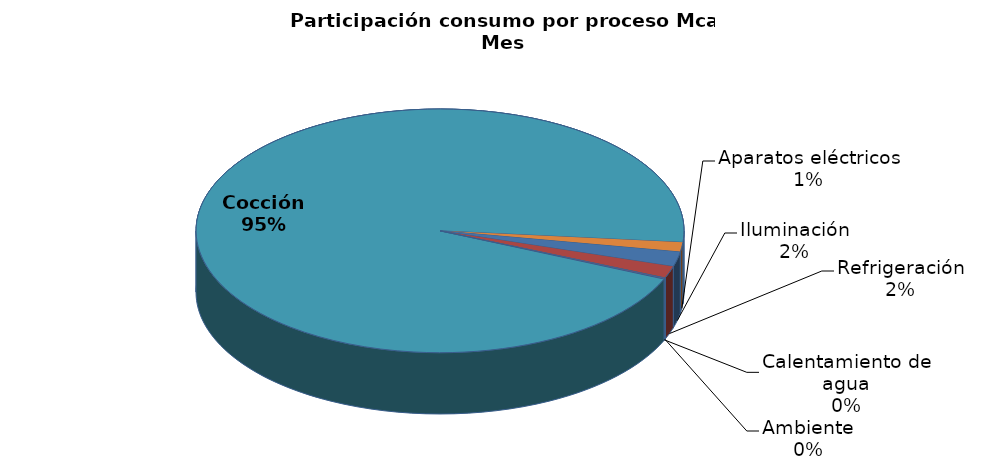
| Category | Series 0 |
|---|---|
| Iluminación | 0.02 |
| Refrigeración | 0.016 |
| Ambiente | 0 |
| Calentamiento de agua | 0.001 |
| Cocción | 0.95 |
| Aparatos eléctricos | 0.013 |